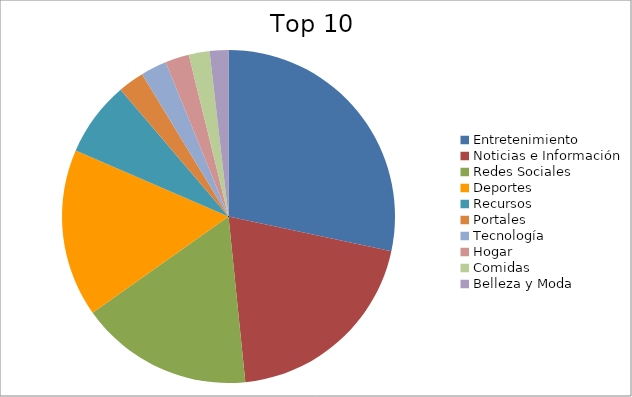
| Category | Series 0 |
|---|---|
| Entretenimiento | 26.01 |
| Noticias e Información | 18.4 |
| Redes Sociales | 15.42 |
| Deportes | 14.97 |
| Recursos | 6.68 |
| Portales | 2.33 |
| Tecnología | 2.32 |
| Hogar | 2.13 |
| Comidas | 1.85 |
| Belleza y Moda | 1.67 |